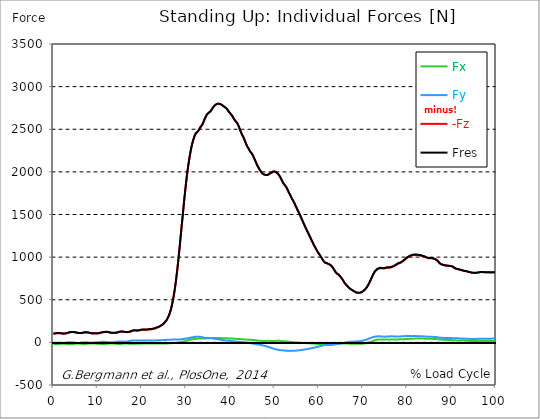
| Category |  Fx |  Fy |  -Fz |  Fres |
|---|---|---|---|---|
| 0.0 | -18.95 | -6.39 | 101.7 | 104.02 |
| 0.167348456675344 | -19.83 | -5.31 | 102.12 | 104.5 |
| 0.334696913350688 | -20.52 | -4.25 | 102.99 | 105.43 |
| 0.5020453700260321 | -20.93 | -3.79 | 104.69 | 107.17 |
| 0.669393826701376 | -21.33 | -3.33 | 106.39 | 108.9 |
| 0.83674228337672 | -21.33 | -2.93 | 106.82 | 109.28 |
| 1.0040907400520642 | -20.87 | -2.69 | 107.28 | 109.61 |
| 1.1621420602454444 | -20.38 | -2.68 | 107.64 | 109.83 |
| 1.3294905169207885 | -19.74 | -3.26 | 107.68 | 109.74 |
| 1.4968389735961325 | -18.73 | -4.31 | 106.97 | 108.9 |
| 1.6641874302714765 | -17.94 | -5.04 | 106.17 | 108.02 |
| 1.8315358869468206 | -17.32 | -5.8 | 104.8 | 106.67 |
| 1.9988843436221646 | -16.83 | -6.43 | 103.33 | 105.25 |
| 2.1662328002975086 | -16.65 | -6.46 | 102.22 | 104.13 |
| 2.333581256972853 | -16.76 | -5.99 | 101.69 | 103.56 |
| 2.5009297136481967 | -17.11 | -5.12 | 102.4 | 104.26 |
| 2.6682781703235405 | -17.43 | -4.11 | 103.78 | 105.62 |
| 2.8356266269988843 | -18.03 | -2.83 | 105.19 | 107.12 |
| 3.002975083674229 | -18.79 | -1.62 | 106.74 | 108.77 |
| 3.1703235403495724 | -19.62 | -0.56 | 108.51 | 110.61 |
| 3.337671997024917 | -20.6 | 0.59 | 111.41 | 113.63 |
| 3.4957233172182973 | -21.47 | 1.48 | 114.79 | 117.12 |
| 3.663071773893641 | -21.78 | 1.9 | 117.22 | 119.61 |
| 3.8304202305689854 | -21.71 | 1.78 | 119.08 | 121.42 |
| 3.997768687244329 | -21.22 | 1.15 | 120 | 122.26 |
| 4.165117143919673 | -20.63 | 0.44 | 120.67 | 122.82 |
| 4.332465600595017 | -19.9 | -0.43 | 120.97 | 123.01 |
| 4.499814057270361 | -18.93 | -1.57 | 120.66 | 122.59 |
| 4.667162513945706 | -17.88 | -2.87 | 119.97 | 121.8 |
| 4.834510970621049 | -16.75 | -4.29 | 118.52 | 120.27 |
| 5.001859427296393 | -15.74 | -5.57 | 116.65 | 118.37 |
| 5.169207883971737 | -15.13 | -6.3 | 114.49 | 116.21 |
| 5.336556340647081 | -14.53 | -6.85 | 112.23 | 113.95 |
| 5.503904797322425 | -14.3 | -6.91 | 110.85 | 112.57 |
| 5.671253253997769 | -14.35 | -6.66 | 109.73 | 111.44 |
| 5.82930457419115 | -14.7 | -6 | 108.88 | 110.58 |
| 5.996653030866494 | -15.18 | -5.16 | 108.25 | 109.96 |
| 6.164001487541838 | -15.8 | -4.09 | 108.26 | 110.01 |
| 6.331349944217181 | -16.39 | -3.07 | 108.8 | 110.62 |
| 6.498698400892526 | -17.21 | -1.79 | 109.92 | 111.84 |
| 6.66604685756787 | -17.98 | -0.72 | 111.76 | 113.8 |
| 6.833395314243213 | -18.41 | 0.12 | 113.68 | 115.89 |
| 7.000743770918558 | -18.77 | 0.9 | 115.55 | 117.91 |
| 7.168092227593902 | -18.75 | 1.13 | 116.49 | 118.83 |
| 7.335440684269246 | -18.21 | 0.77 | 116.96 | 119.2 |
| 7.50278914094459 | -17.17 | -0.14 | 117.09 | 119.18 |
| 7.6701375976199335 | -16.28 | -1.16 | 116.44 | 118.43 |
| 7.837486054295278 | -15.41 | -2.4 | 115.11 | 117.03 |
| 7.995537374488658 | -14.62 | -3.34 | 113.43 | 115.25 |
| 8.162885831164003 | -13.7 | -4.33 | 110.94 | 112.75 |
| 8.330234287839346 | -13.04 | -4.9 | 108.88 | 110.69 |
| 8.49758274451469 | -12.88 | -4.81 | 107.53 | 109.36 |
| 8.664931201190035 | -13.03 | -4.26 | 105.98 | 107.82 |
| 8.832279657865378 | -13.24 | -3.61 | 105.2 | 107.1 |
| 8.999628114540721 | -13.65 | -2.64 | 104.92 | 106.88 |
| 9.166976571216066 | -14.26 | -1.61 | 105.4 | 107.37 |
| 9.334325027891412 | -14.66 | -0.99 | 106.18 | 108.16 |
| 9.501673484566755 | -14.4 | -1.33 | 105.18 | 107.12 |
| 9.669021941242098 | -14.53 | -1.42 | 103.83 | 105.83 |
| 9.836370397917442 | -15.15 | -0.41 | 103.83 | 105.94 |
| 10.003718854592787 | -15.74 | 0.71 | 104.64 | 106.82 |
| 10.17106731126813 | -16.47 | 1.88 | 105.92 | 108.18 |
| 10.329118631461512 | -17.34 | 3.14 | 107.48 | 109.85 |
| 10.496467088136853 | -18.37 | 4.31 | 109.42 | 111.91 |
| 10.663815544812199 | -19.44 | 5.34 | 111.59 | 114.24 |
| 10.831164001487544 | -19.91 | 5.85 | 113.74 | 116.44 |
| 10.998512458162887 | -20.33 | 6.36 | 115.75 | 118.49 |
| 11.16586091483823 | -20.53 | 6.7 | 117.61 | 120.36 |
| 11.333209371513574 | -20.34 | 6.65 | 119.14 | 121.84 |
| 11.50055782818892 | -19.96 | 6.43 | 120.31 | 122.92 |
| 11.667906284864264 | -19.17 | 5.8 | 120.85 | 123.31 |
| 11.835254741539607 | -18.4 | 5.24 | 121.25 | 123.57 |
| 12.00260319821495 | -17.57 | 4.5 | 121.5 | 123.68 |
| 12.169951654890292 | -16.66 | 3.56 | 121.32 | 123.36 |
| 12.337300111565641 | -15.63 | 2.32 | 120.65 | 122.57 |
| 12.504648568240984 | -14.65 | 1.01 | 119.3 | 121.15 |
| 12.662699888434362 | -14.02 | 0.22 | 117.01 | 118.87 |
| 12.830048345109708 | -13.62 | -0.06 | 114.35 | 116.19 |
| 12.997396801785053 | -13.36 | -0.18 | 112.12 | 113.94 |
| 13.164745258460396 | -13.33 | 0.07 | 110.96 | 112.75 |
| 13.33209371513574 | -13.43 | 0.55 | 110.45 | 112.2 |
| 13.499442171811083 | -13.82 | 1.34 | 110.39 | 112.15 |
| 13.666790628486426 | -14.36 | 2.23 | 110.62 | 112.42 |
| 13.834139085161771 | -14.88 | 3.37 | 111.03 | 112.91 |
| 14.001487541837117 | -15.49 | 4.52 | 111.25 | 113.24 |
| 14.16883599851246 | -16.25 | 5.83 | 112.22 | 114.34 |
| 14.336184455187803 | -17.14 | 7.27 | 113.79 | 116.07 |
| 14.503532911863147 | -18.07 | 8.73 | 115.67 | 118.14 |
| 14.670881368538492 | -18.93 | 9.89 | 118.17 | 120.82 |
| 14.828932688731873 | -19.43 | 10.65 | 120.68 | 123.39 |
| 14.996281145407215 | -19.45 | 11 | 122.83 | 125.49 |
| 15.163629602082558 | -19.11 | 11.27 | 124.26 | 126.83 |
| 15.330978058757903 | -18.43 | 11.17 | 125.12 | 127.53 |
| 15.498326515433247 | -17.55 | 10.73 | 125.49 | 127.71 |
| 15.665674972108594 | -16.46 | 9.97 | 125.31 | 127.34 |
| 15.833023428783937 | -15.27 | 9.03 | 124.56 | 126.36 |
| 16.00037188545928 | -14.5 | 8.61 | 123.25 | 124.95 |
| 16.167720342134626 | -14.01 | 8.43 | 121.8 | 123.44 |
| 16.335068798809967 | -13.74 | 8.47 | 120.46 | 122.08 |
| 16.502417255485312 | -13.81 | 9.07 | 119.84 | 121.52 |
| 16.669765712160658 | -14.16 | 10.24 | 119.96 | 121.79 |
| 16.837114168836 | -14.66 | 11.73 | 120.41 | 122.44 |
| 17.004462625511344 | -15.26 | 13.4 | 121.23 | 123.51 |
| 17.16251394570472 | -15.92 | 15.22 | 122.33 | 124.89 |
| 17.32986240238007 | -16.68 | 16.99 | 123.91 | 126.77 |
| 17.497210859055414 | -17.42 | 18.82 | 126.84 | 130.02 |
| 17.664559315730756 | -17.77 | 20.68 | 131.81 | 135.21 |
| 17.8319077724061 | -17.7 | 21.65 | 134.82 | 138.28 |
| 17.999256229081443 | -17.43 | 22.18 | 137.16 | 140.61 |
| 18.166604685756788 | -17.04 | 22.25 | 138.45 | 141.85 |
| 18.333953142432133 | -16.48 | 21.97 | 139.06 | 142.39 |
| 18.501301599107478 | -15.66 | 21.23 | 139.08 | 142.28 |
| 18.668650055782823 | -15.13 | 20.84 | 138.05 | 141.19 |
| 18.835998512458165 | -14.66 | 20.53 | 136.92 | 140.01 |
| 19.00334696913351 | -14.44 | 20.67 | 136.9 | 139.95 |
| 19.170695425808855 | -14.57 | 21.19 | 137.94 | 140.99 |
| 19.338043882484197 | -14.85 | 21.8 | 139.03 | 142.14 |
| 19.496095202677576 | -14.75 | 22.27 | 141.09 | 144.27 |
| 19.66344365935292 | -14.87 | 23.18 | 143.44 | 146.82 |
| 19.830792116028263 | -14.69 | 23.71 | 145.34 | 148.83 |
| 19.998140572703612 | -14 | 23.32 | 146.78 | 150.2 |
| 20.165489029378953 | -13.68 | 23.1 | 146.99 | 150.36 |
| 20.3328374860543 | -13.72 | 23.26 | 146.9 | 150.29 |
| 20.500185942729644 | -13.92 | 23.66 | 147.67 | 151.07 |
| 20.667534399404985 | -13.24 | 23.11 | 147.7 | 151.02 |
| 20.83488285608033 | -12.76 | 22.62 | 147.37 | 150.63 |
| 21.002231312755672 | -12.52 | 22.38 | 147.09 | 150.32 |
| 21.16957976943102 | -12.3 | 22.67 | 147.82 | 151.14 |
| 21.336928226106362 | -12.22 | 23.26 | 149.07 | 152.52 |
| 21.504276682781704 | -12.39 | 23.76 | 150.97 | 154.52 |
| 21.67162513945705 | -12.21 | 23.61 | 152.28 | 155.76 |
| 21.82967645965043 | -12 | 23.01 | 152.2 | 155.53 |
| 21.997024916325774 | -11.8 | 22.41 | 152.11 | 155.29 |
| 22.16437337300112 | -11.9 | 22.53 | 152.92 | 156.05 |
| 22.33172182967646 | -12.11 | 22.96 | 155.62 | 158.8 |
| 22.499070286351806 | -11.99 | 23.09 | 157.98 | 161.13 |
| 22.666418743027148 | -11.96 | 23.01 | 159.74 | 162.86 |
| 22.833767199702496 | -11.93 | 22.93 | 161.5 | 164.58 |
| 23.00111565637784 | -12.1 | 22.74 | 163.49 | 166.49 |
| 23.168464113053183 | -12.46 | 23.01 | 166.6 | 169.6 |
| 23.335812569728528 | -13.22 | 23.83 | 171.28 | 174.37 |
| 23.50316102640387 | -13.68 | 24.16 | 175.34 | 178.43 |
| 23.670509483079215 | -13.35 | 23.53 | 177.13 | 180.07 |
| 23.83785793975456 | -13.6 | 23.95 | 180.99 | 183.93 |
| 23.995909259947936 | -13.93 | 24.53 | 185.18 | 188.16 |
| 24.163257716623285 | -14.23 | 25.14 | 189.67 | 192.67 |
| 24.330606173298627 | -14.26 | 25.81 | 195.99 | 199.02 |
| 24.49795462997397 | -14.14 | 26.16 | 201.3 | 204.3 |
| 24.665303086649313 | -14.01 | 26.51 | 206.6 | 209.58 |
| 24.83265154332466 | -13.96 | 27.32 | 214.2 | 217.13 |
| 25.0 | -13.74 | 27.9 | 222.13 | 224.99 |
| 25.167348456675345 | -13.43 | 28.34 | 230.17 | 232.95 |
| 25.334696913350694 | -13.08 | 28.65 | 241.11 | 243.79 |
| 25.502045370026035 | -12.74 | 28.96 | 253.12 | 255.7 |
| 25.669393826701377 | -12.45 | 29.4 | 266.22 | 268.7 |
| 25.836742283376722 | -12.02 | 29.55 | 281.76 | 284.12 |
| 26.004090740052067 | -11.54 | 29.63 | 299.74 | 301.97 |
| 26.17143919672741 | -11.18 | 29.87 | 321.17 | 323.26 |
| 26.329490516920792 | -10.83 | 30.53 | 344.52 | 346.5 |
| 26.49683897359613 | -10.69 | 31.3 | 372.14 | 374.03 |
| 26.66418743027148 | -10.32 | 32.02 | 405.16 | 406.94 |
| 26.831535886946828 | -9.51 | 32.58 | 443.07 | 444.72 |
| 26.998884343622166 | -8.47 | 32.81 | 486.25 | 487.76 |
| 27.166232800297514 | -7.79 | 33 | 532.6 | 533.99 |
| 27.333581256972852 | -7.38 | 33.29 | 582.32 | 583.61 |
| 27.5009297136482 | -6.59 | 33.5 | 638.77 | 639.96 |
| 27.668278170323543 | -5.3 | 33.6 | 700.53 | 701.61 |
| 27.835626626998888 | -4.01 | 33.65 | 769.99 | 770.96 |
| 28.002975083674233 | -2.94 | 33.77 | 845.2 | 846.08 |
| 28.170323540349575 | -2.08 | 34.15 | 921.95 | 922.75 |
| 28.33767199702492 | -1 | 34.62 | 1003.97 | 1004.71 |
| 28.50502045370026 | 0.47 | 35.14 | 1089.27 | 1089.96 |
| 28.663071773893645 | 2.12 | 35.21 | 1179.12 | 1179.76 |
| 28.830420230568986 | 4 | 35.57 | 1268 | 1268.6 |
| 28.99776868724433 | 5.78 | 36.4 | 1357.55 | 1358.15 |
| 29.165117143919673 | 7.48 | 37.52 | 1446.1 | 1446.71 |
| 29.33246560059502 | 9.39 | 39.18 | 1533.57 | 1534.2 |
| 29.499814057270367 | 11.73 | 40.61 | 1624.47 | 1625.13 |
| 29.66716251394571 | 14.02 | 41.93 | 1710.84 | 1711.53 |
| 29.834510970621054 | 16.18 | 43.02 | 1789.78 | 1790.49 |
| 30.00185942729639 | 18.64 | 44.64 | 1868.12 | 1868.88 |
| 30.169207883971744 | 21.11 | 46.15 | 1944.67 | 1945.48 |
| 30.33655634064708 | 23.44 | 47.69 | 2012.21 | 2013.08 |
| 30.50390479732243 | 25.78 | 49.54 | 2073.19 | 2074.13 |
| 30.671253253997772 | 27.84 | 51.16 | 2130.6 | 2131.59 |
| 30.829304574191156 | 29.73 | 52.86 | 2184.21 | 2185.26 |
| 30.996653030866494 | 31.62 | 54.97 | 2233.22 | 2234.33 |
| 31.164001487541842 | 33.61 | 57.15 | 2276.81 | 2277.99 |
| 31.331349944217187 | 35.44 | 58.9 | 2315.51 | 2316.75 |
| 31.498698400892525 | 36.93 | 60.42 | 2350.05 | 2351.33 |
| 31.666046857567874 | 38.24 | 61.96 | 2379.64 | 2380.96 |
| 31.833395314243212 | 39.53 | 63.42 | 2406.24 | 2407.61 |
| 32.00074377091856 | 40.9 | 64.6 | 2430.07 | 2431.48 |
| 32.1680922275939 | 42.04 | 66.1 | 2448.75 | 2450.22 |
| 32.33544068426925 | 42.78 | 66.81 | 2457.16 | 2458.65 |
| 32.50278914094459 | 43.4 | 67.12 | 2464.99 | 2466.5 |
| 32.670137597619934 | 43.88 | 67 | 2472.52 | 2474.03 |
| 32.83748605429528 | 44.17 | 66.46 | 2485.24 | 2486.72 |
| 33.004834510970625 | 44.36 | 65.78 | 2500.3 | 2501.75 |
| 33.162885831164004 | 44.44 | 64.95 | 2518.02 | 2519.44 |
| 33.33023428783935 | 44.59 | 64.14 | 2530.42 | 2531.81 |
| 33.497582744514695 | 44.51 | 62.87 | 2540.84 | 2542.18 |
| 33.664931201190036 | 44.38 | 61.35 | 2552.45 | 2553.74 |
| 33.83227965786538 | 44.6 | 59.26 | 2571.8 | 2573.03 |
| 33.99962811454073 | 44.6 | 56.2 | 2592.96 | 2594.12 |
| 34.16697657121607 | 44.98 | 52.89 | 2614.1 | 2615.21 |
| 34.33432502789141 | 45.64 | 51.89 | 2633.05 | 2634.15 |
| 34.50167348456676 | 46.86 | 51.38 | 2650.87 | 2651.99 |
| 34.6690219412421 | 47.68 | 50.07 | 2667.28 | 2668.39 |
| 34.83637039791744 | 48.88 | 50.07 | 2679.26 | 2680.39 |
| 35.00371885459279 | 49.5 | 50.25 | 2686.07 | 2687.22 |
| 35.17106731126814 | 50.19 | 49.84 | 2694.07 | 2695.23 |
| 35.338415767943474 | 50.49 | 49.52 | 2701.64 | 2702.8 |
| 35.49646708813686 | 50.67 | 49.27 | 2708.96 | 2710.13 |
| 35.6638155448122 | 50.89 | 48.69 | 2719.05 | 2720.2 |
| 35.831164001487544 | 51.17 | 47.76 | 2732.56 | 2733.7 |
| 35.998512458162885 | 51.65 | 46.46 | 2746.72 | 2747.84 |
| 36.165860914838234 | 52.19 | 45.1 | 2759.29 | 2760.4 |
| 36.333209371513576 | 52.53 | 43.53 | 2770.72 | 2771.81 |
| 36.50055782818892 | 52.52 | 41.55 | 2780.06 | 2781.12 |
| 36.667906284864266 | 51.93 | 39.77 | 2787.34 | 2788.37 |
| 36.83525474153961 | 51.25 | 38.24 | 2792.24 | 2793.23 |
| 37.002603198214956 | 50.57 | 37.38 | 2796.96 | 2797.92 |
| 37.1699516548903 | 50.26 | 36.47 | 2798.66 | 2799.61 |
| 37.337300111565646 | 50.01 | 35.22 | 2798.79 | 2799.72 |
| 37.50464856824098 | 50.08 | 34.15 | 2798.06 | 2798.99 |
| 37.66269988843437 | 50.1 | 32.91 | 2795.92 | 2796.84 |
| 37.83004834510971 | 50.04 | 31.35 | 2792.56 | 2793.48 |
| 37.99739680178505 | 49.88 | 29.79 | 2788.14 | 2789.06 |
| 38.16474525846039 | 49.46 | 28.24 | 2782.06 | 2782.96 |
| 38.33209371513574 | 48.65 | 26.58 | 2774.82 | 2775.69 |
| 38.49944217181109 | 48.17 | 25.16 | 2768.79 | 2769.65 |
| 38.666790628486424 | 48.08 | 23.99 | 2763.05 | 2763.9 |
| 38.83413908516178 | 47.91 | 22.76 | 2757.19 | 2758.04 |
| 39.001487541837115 | 47.64 | 21.49 | 2751.21 | 2752.05 |
| 39.16883599851246 | 47.36 | 20.64 | 2742.06 | 2742.89 |
| 39.336184455187805 | 47.03 | 20.19 | 2732.04 | 2732.88 |
| 39.503532911863154 | 46.82 | 19.83 | 2720.09 | 2720.92 |
| 39.670881368538495 | 46.29 | 20.03 | 2705.13 | 2705.96 |
| 39.83822982521384 | 46.03 | 18.93 | 2695.16 | 2695.99 |
| 39.996281145407224 | 45.87 | 17.73 | 2685.5 | 2686.33 |
| 40.163629602082565 | 45.66 | 16.47 | 2675.66 | 2676.49 |
| 40.33097805875791 | 45.22 | 15.48 | 2664.23 | 2665.06 |
| 40.498326515433256 | 44.74 | 14.49 | 2652.03 | 2652.87 |
| 40.6656749721086 | 43.96 | 13.43 | 2634.72 | 2635.56 |
| 40.83302342878393 | 43.15 | 12.28 | 2619.72 | 2620.56 |
| 41.00037188545929 | 42.45 | 11.26 | 2607.71 | 2608.55 |
| 41.16772034213463 | 41.82 | 10.43 | 2597.73 | 2598.57 |
| 41.33506879880997 | 41.38 | 9.6 | 2587.44 | 2588.3 |
| 41.50241725548531 | 41.06 | 8.76 | 2576.97 | 2577.84 |
| 41.66976571216066 | 40.67 | 8.12 | 2562.93 | 2563.8 |
| 41.837114168836 | 40.21 | 7.61 | 2543.01 | 2543.89 |
| 42.004462625511344 | 39.63 | 6.84 | 2521.35 | 2522.22 |
| 42.17181108218669 | 38.76 | 6.01 | 2498.41 | 2499.29 |
| 42.32986240238007 | 37.81 | 5.02 | 2476.21 | 2477.08 |
| 42.497210859055414 | 36.92 | 4.38 | 2454.61 | 2455.47 |
| 42.66455931573076 | 36.57 | 3.66 | 2436.86 | 2437.73 |
| 42.831907772406105 | 36.21 | 3 | 2420.46 | 2421.34 |
| 42.999256229081446 | 35.81 | 2.28 | 2403.3 | 2404.18 |
| 43.16660468575679 | 34.69 | 1.13 | 2382.13 | 2383.02 |
| 43.33395314243214 | 33.83 | 0.17 | 2360.02 | 2360.9 |
| 43.50130159910748 | 33.21 | -0.47 | 2338.43 | 2339.32 |
| 43.66865005578282 | 32.49 | -1.14 | 2317.87 | 2318.75 |
| 43.83599851245817 | 31.44 | -2 | 2298.36 | 2299.25 |
| 44.00334696913351 | 30.79 | -3.3 | 2282.78 | 2283.68 |
| 44.17069542580886 | 30.47 | -4.91 | 2270.1 | 2271.02 |
| 44.3380438824842 | 29.85 | -6.44 | 2252.74 | 2253.69 |
| 44.49609520267758 | 29.58 | -8.17 | 2237.77 | 2238.74 |
| 44.66344365935292 | 29.63 | -9.83 | 2227.21 | 2228.23 |
| 44.83079211602827 | 29.38 | -11.67 | 2216.89 | 2217.97 |
| 44.99814057270361 | 29.12 | -13.15 | 2203.04 | 2204.16 |
| 45.16548902937895 | 28.73 | -14.45 | 2186.82 | 2187.96 |
| 45.332837486054295 | 27.56 | -15.9 | 2166.68 | 2167.83 |
| 45.500185942729644 | 26.47 | -17.05 | 2147.42 | 2148.59 |
| 45.66753439940499 | 25.32 | -18.38 | 2128.2 | 2129.39 |
| 45.83488285608033 | 23.77 | -19.82 | 2108.15 | 2109.37 |
| 46.00223131275568 | 22.32 | -21.3 | 2087.95 | 2089.19 |
| 46.16957976943102 | 21.27 | -22.86 | 2070.03 | 2071.32 |
| 46.336928226106366 | 20.43 | -24.2 | 2054.08 | 2055.4 |
| 46.50427668278171 | 19.83 | -25.61 | 2038.1 | 2039.45 |
| 46.671625139457056 | 19.29 | -27.27 | 2023.62 | 2025 |
| 46.829676459650436 | 18.77 | -28.86 | 2010.26 | 2011.66 |
| 46.99702491632577 | 18.22 | -30.49 | 1997.85 | 1999.26 |
| 47.16437337300112 | 17.55 | -32.87 | 1987.12 | 1988.53 |
| 47.33172182967646 | 16.98 | -35.37 | 1977.55 | 1978.97 |
| 47.49907028635181 | 16.89 | -37.79 | 1971.44 | 1972.85 |
| 47.66641874302716 | 17.12 | -40.09 | 1968.29 | 1969.69 |
| 47.83376719970249 | 17.3 | -42.41 | 1966.06 | 1967.49 |
| 48.001115656377834 | 17.39 | -44.08 | 1962.87 | 1964.32 |
| 48.16846411305319 | 17.44 | -45.89 | 1960.5 | 1961.99 |
| 48.33581256972853 | 17.58 | -48.23 | 1962.06 | 1963.56 |
| 48.50316102640387 | 17.75 | -50.53 | 1965.33 | 1966.82 |
| 48.67050948307921 | 17.88 | -53.5 | 1969.05 | 1970.53 |
| 48.837857939754564 | 17.16 | -56.79 | 1975.62 | 1977.16 |
| 49.005206396429905 | 16.42 | -60.11 | 1982.37 | 1984 |
| 49.163257716623285 | 16.41 | -62.84 | 1984.5 | 1986.18 |
| 49.33060617329863 | 16.77 | -65.36 | 1989.47 | 1991.22 |
| 49.49795462997397 | 17.1 | -68.01 | 1995.98 | 1997.82 |
| 49.66530308664932 | 17.11 | -70.8 | 2001.95 | 2003.87 |
| 49.832651543324666 | 16.87 | -74 | 2004.3 | 2006.31 |
| 50.0 | 16.83 | -77.18 | 2003.79 | 2005.9 |
| 50.16734845667534 | 17.33 | -79.4 | 2001.47 | 2003.67 |
| 50.33469691335069 | 17.47 | -81.22 | 1995.03 | 1997.29 |
| 50.50204537002604 | 18.16 | -83.22 | 1989.42 | 1991.75 |
| 50.66939382670139 | 18.85 | -85.38 | 1982.25 | 1984.63 |
| 50.836742283376715 | 18.55 | -87.07 | 1973.04 | 1975.5 |
| 51.00409074005207 | 18.14 | -89.01 | 1962.13 | 1964.68 |
| 51.17143919672741 | 17.72 | -90.49 | 1948.32 | 1950.93 |
| 51.32949051692079 | 17.23 | -91.41 | 1933.58 | 1936.22 |
| 51.496838973596134 | 16.56 | -91.84 | 1917.01 | 1919.66 |
| 51.66418743027148 | 15.51 | -92.17 | 1898.76 | 1901.43 |
| 51.831535886946824 | 14.08 | -92.86 | 1881.08 | 1883.82 |
| 51.99888434362217 | 13.44 | -94.27 | 1866.05 | 1868.86 |
| 52.16623280029752 | 13.19 | -95.65 | 1853.83 | 1856.72 |
| 52.33358125697285 | 12.95 | -96.46 | 1842.42 | 1845.36 |
| 52.5009297136482 | 12.63 | -96.9 | 1831.1 | 1834.07 |
| 52.668278170323546 | 12.05 | -97.56 | 1818.37 | 1821.37 |
| 52.835626626998895 | 10.95 | -98.32 | 1802.55 | 1805.57 |
| 53.00297508367424 | 9.61 | -99 | 1783.55 | 1786.61 |
| 53.17032354034958 | 8.43 | -99.66 | 1764.79 | 1767.9 |
| 53.33767199702492 | 7.39 | -100.01 | 1747.81 | 1750.95 |
| 53.50502045370027 | 6.7 | -99.66 | 1731.56 | 1734.69 |
| 53.663071773893655 | 5.82 | -99.64 | 1713.57 | 1716.72 |
| 53.83042023056899 | 5 | -99.71 | 1695.72 | 1698.89 |
| 53.99776868724433 | 4.08 | -99.37 | 1679.71 | 1682.88 |
| 54.16511714391967 | 3.4 | -98.9 | 1664.7 | 1667.86 |
| 54.33246560059503 | 2.61 | -98.88 | 1649.37 | 1652.53 |
| 54.49981405727037 | 1.71 | -98.29 | 1630.66 | 1633.8 |
| 54.667162513945705 | 0.84 | -98 | 1612.35 | 1615.51 |
| 54.834510970621054 | -0.19 | -97.32 | 1593.59 | 1596.75 |
| 55.0018594272964 | -1.12 | -96.29 | 1574.87 | 1577.99 |
| 55.169207883971744 | -1.76 | -95.26 | 1556.77 | 1559.85 |
| 55.336556340647086 | -2.34 | -94.55 | 1540.38 | 1543.45 |
| 55.50390479732243 | -3.01 | -93.54 | 1522.53 | 1525.56 |
| 55.671253253997776 | -3.76 | -92.37 | 1503.36 | 1506.35 |
| 55.83860171067312 | -4.4 | -91.3 | 1483.61 | 1486.57 |
| 55.9966530308665 | -4.86 | -90.17 | 1463.87 | 1466.8 |
| 56.16400148754184 | -5.42 | -88.8 | 1444.08 | 1446.96 |
| 56.33134994421718 | -5.89 | -87.26 | 1425.05 | 1427.87 |
| 56.498698400892536 | -6.4 | -86.04 | 1405.33 | 1408.11 |
| 56.66604685756788 | -7.11 | -84.77 | 1385.47 | 1388.22 |
| 56.83339531424321 | -7.87 | -83.21 | 1366.09 | 1368.79 |
| 57.00074377091856 | -8.38 | -81.76 | 1347.29 | 1349.94 |
| 57.16809222759391 | -8.64 | -80.06 | 1328.86 | 1331.45 |
| 57.33544068426925 | -9.3 | -78.27 | 1310.7 | 1313.22 |
| 57.5027891409446 | -9.77 | -77.1 | 1294.15 | 1296.64 |
| 57.670137597619934 | -10.25 | -75.48 | 1275.9 | 1278.34 |
| 57.83748605429528 | -10.67 | -74.43 | 1257.1 | 1259.52 |
| 58.004834510970625 | -11.18 | -72.66 | 1238.82 | 1241.19 |
| 58.16288583116401 | -11.9 | -70.51 | 1220.8 | 1223.09 |
| 58.330234287839346 | -12.43 | -68.42 | 1203.07 | 1205.29 |
| 58.497582744514695 | -13 | -66.41 | 1184.75 | 1186.9 |
| 58.66493120119004 | -13.4 | -64.48 | 1166.53 | 1168.62 |
| 58.832279657865385 | -13.58 | -62.84 | 1148.66 | 1150.71 |
| 58.999628114540734 | -14.04 | -61.37 | 1131.5 | 1133.52 |
| 59.16697657121607 | -14.78 | -59.48 | 1115.45 | 1117.43 |
| 59.33432502789142 | -15.72 | -57.39 | 1100.33 | 1102.26 |
| 59.50167348456676 | -16.93 | -55.56 | 1085.46 | 1087.35 |
| 59.66902194124211 | -17.68 | -53.31 | 1070.42 | 1072.26 |
| 59.83637039791745 | -18.46 | -50.73 | 1055.45 | 1057.23 |
| 60.00371885459278 | -19.34 | -48.32 | 1042.35 | 1044.06 |
| 60.17106731126813 | -20.29 | -46.09 | 1031.04 | 1032.68 |
| 60.33841576794349 | -20.41 | -44.23 | 1017.06 | 1018.63 |
| 60.49646708813685 | -20.47 | -42 | 1002.97 | 1004.51 |
| 60.6638155448122 | -20.47 | -39.64 | 988.92 | 990.45 |
| 60.831164001487544 | -20.37 | -37.12 | 974.1 | 975.61 |
| 60.99851245816289 | -20.31 | -34.66 | 960.45 | 961.96 |
| 61.16586091483824 | -20.15 | -32.76 | 948.52 | 950.04 |
| 61.333209371513576 | -20.22 | -31.25 | 938.68 | 940.22 |
| 61.50055782818892 | -20.57 | -29.84 | 932.53 | 934.06 |
| 61.667906284864266 | -20.49 | -29.79 | 930.81 | 932.35 |
| 61.835254741539615 | -19.99 | -30.27 | 928.64 | 930.2 |
| 62.002603198214956 | -19.32 | -30.93 | 923.67 | 925.28 |
| 62.16995165489029 | -19.16 | -31.04 | 919.23 | 920.85 |
| 62.33730011156564 | -19.3 | -30.82 | 915.67 | 917.29 |
| 62.504648568240995 | -19.43 | -30.61 | 912.02 | 913.65 |
| 62.67199702491633 | -19.16 | -30.57 | 906.53 | 908.18 |
| 62.83004834510971 | -18.74 | -29.75 | 898.42 | 900.1 |
| 62.99739680178505 | -18.29 | -29.15 | 888.94 | 890.64 |
| 63.1647452584604 | -17.79 | -28.47 | 877.31 | 879.01 |
| 63.33209371513575 | -17.32 | -27.83 | 864.38 | 866.08 |
| 63.4994421718111 | -16.68 | -26.66 | 850.38 | 852.07 |
| 63.666790628486424 | -16 | -24.85 | 835.13 | 836.79 |
| 63.83413908516177 | -15.56 | -22.94 | 822.03 | 823.67 |
| 64.00148754183712 | -15.31 | -20.99 | 811.37 | 812.99 |
| 64.16883599851248 | -15.23 | -19.52 | 803.68 | 805.27 |
| 64.3361844551878 | -15.24 | -18.07 | 799.84 | 801.42 |
| 64.50353291186315 | -15.12 | -16.74 | 794.33 | 795.88 |
| 64.6708813685385 | -14.83 | -15.55 | 784.65 | 786.19 |
| 64.83822982521384 | -14.41 | -14.32 | 774.22 | 775.77 |
| 65.00557828188919 | -14 | -12.99 | 763.98 | 765.51 |
| 65.16362960208257 | -13.82 | -11.2 | 752.69 | 754.2 |
| 65.3309780587579 | -13.61 | -9.54 | 740.57 | 742.03 |
| 65.49832651543326 | -13.36 | -7.71 | 727.06 | 728.48 |
| 65.6656749721086 | -13.42 | -5.46 | 711.85 | 713.21 |
| 65.83302342878395 | -13.46 | -3.25 | 697.87 | 699.17 |
| 66.00037188545929 | -13.52 | -1.26 | 686.54 | 687.81 |
| 66.16772034213463 | -13.74 | 0.21 | 677.2 | 678.44 |
| 66.33506879880998 | -13.96 | 1.19 | 668.98 | 670.21 |
| 66.50241725548531 | -14.11 | 2.7 | 658.84 | 660.04 |
| 66.66976571216065 | -14.48 | 4.37 | 649.31 | 650.5 |
| 66.83711416883601 | -14.69 | 5.8 | 640.21 | 641.38 |
| 67.00446262551135 | -14.9 | 7.19 | 632.04 | 633.18 |
| 67.1718110821867 | -15.24 | 8.03 | 625.59 | 626.68 |
| 67.32986240238007 | -15.53 | 7.96 | 620.02 | 621.05 |
| 67.49721085905541 | -15.94 | 7.88 | 615.05 | 616.03 |
| 67.66455931573076 | -16.14 | 8.71 | 609.99 | 610.93 |
| 67.83190777240611 | -16.16 | 9.26 | 604.03 | 604.93 |
| 67.99925622908145 | -16.25 | 8.96 | 598.34 | 599.2 |
| 68.16660468575678 | -16.32 | 9.74 | 593.53 | 594.36 |
| 68.33395314243214 | -16.11 | 10.54 | 588.25 | 589.06 |
| 68.50130159910749 | -16.38 | 11.31 | 585.39 | 586.19 |
| 68.66865005578282 | -16.44 | 11.85 | 582.9 | 583.68 |
| 68.83599851245816 | -16.04 | 12.42 | 580.82 | 581.58 |
| 69.00334696913352 | -16.18 | 13.36 | 580.83 | 581.6 |
| 69.17069542580886 | -16.11 | 14.32 | 580.86 | 581.63 |
| 69.3380438824842 | -16.05 | 15.19 | 581.85 | 582.62 |
| 69.50539233915956 | -15.86 | 16.2 | 584.71 | 585.51 |
| 69.66344365935292 | -15.57 | 17.45 | 588.29 | 589.1 |
| 69.83079211602826 | -15.19 | 18.85 | 593.11 | 593.94 |
| 69.99814057270362 | -14.64 | 20.43 | 598.82 | 599.67 |
| 70.16548902937896 | -14.08 | 22.38 | 605.84 | 606.73 |
| 70.33283748605429 | -13.14 | 24.67 | 613.27 | 614.22 |
| 70.50018594272964 | -11.79 | 27.22 | 621.87 | 622.88 |
| 70.667534399405 | -10.39 | 30.23 | 631.97 | 633.08 |
| 70.83488285608033 | -8.76 | 33.45 | 643.32 | 644.56 |
| 71.00223131275568 | -6.75 | 36.76 | 655.94 | 657.33 |
| 71.16957976943102 | -4.36 | 40.25 | 670.45 | 672.01 |
| 71.33692822610637 | -1.78 | 43.91 | 686.47 | 688.25 |
| 71.50427668278171 | 0.98 | 47.51 | 703.65 | 705.67 |
| 71.67162513945706 | 4.19 | 50.96 | 721.83 | 724.08 |
| 71.8389735961324 | 7.81 | 54.5 | 740.54 | 743.08 |
| 71.99702491632577 | 11.05 | 57.57 | 759.35 | 762.15 |
| 72.16437337300113 | 14.56 | 60.9 | 779.79 | 782.87 |
| 72.33172182967647 | 17.93 | 63.3 | 797.1 | 800.4 |
| 72.49907028635181 | 21.14 | 65.18 | 812.94 | 816.42 |
| 72.66641874302715 | 24.17 | 66.64 | 826.63 | 830.26 |
| 72.8337671997025 | 26.95 | 67.86 | 838.27 | 842.03 |
| 73.00111565637783 | 29.16 | 68.81 | 847.12 | 851.01 |
| 73.16846411305319 | 30.93 | 69.68 | 854.17 | 858.16 |
| 73.33581256972853 | 32.3 | 70.41 | 859.07 | 863.16 |
| 73.50316102640387 | 33.44 | 70.67 | 863.27 | 867.43 |
| 73.67050948307921 | 34.52 | 70.8 | 867.28 | 871.49 |
| 73.83785793975457 | 34.33 | 70.31 | 870.11 | 874.33 |
| 74.00520639642991 | 34.3 | 69.73 | 870.98 | 875.23 |
| 74.16325771662328 | 34.58 | 69.06 | 869.31 | 873.58 |
| 74.33060617329863 | 34.78 | 68.42 | 867.8 | 872.12 |
| 74.49795462997398 | 34.82 | 67.84 | 866.7 | 871.07 |
| 74.66530308664932 | 34.71 | 67.38 | 866.56 | 870.97 |
| 74.83265154332466 | 34.46 | 67.04 | 867.32 | 871.75 |
| 75.00000000000001 | 34.35 | 67.04 | 869.29 | 873.75 |
| 75.16734845667534 | 34.42 | 67.56 | 872.8 | 877.3 |
| 75.3346969133507 | 34.26 | 68.02 | 875.27 | 879.8 |
| 75.50204537002605 | 33.83 | 68.47 | 875.43 | 879.93 |
| 75.66939382670138 | 33.36 | 68.91 | 875.28 | 879.74 |
| 75.83674228337672 | 33.08 | 69.4 | 875.59 | 880.02 |
| 76.00409074005208 | 32.85 | 69.9 | 876.05 | 880.45 |
| 76.17143919672742 | 32.68 | 70.34 | 877.71 | 882.08 |
| 76.33878765340276 | 32.53 | 70.76 | 879.7 | 884.03 |
| 76.49683897359614 | 32.45 | 70.78 | 882.76 | 887.05 |
| 76.66418743027148 | 32.4 | 70.6 | 886.36 | 890.61 |
| 76.83153588694682 | 32.61 | 70.33 | 890.1 | 894.34 |
| 76.99888434362218 | 33.01 | 70 | 893.96 | 898.21 |
| 77.16623280029752 | 32.97 | 70.19 | 897.97 | 902.27 |
| 77.33358125697285 | 32.95 | 69.42 | 903.35 | 907.63 |
| 77.5009297136482 | 33.03 | 68.5 | 908.83 | 913.08 |
| 77.66827817032356 | 33.53 | 68.56 | 914.76 | 919.03 |
| 77.83562662699889 | 33.97 | 69.12 | 921.19 | 925.48 |
| 78.00297508367423 | 34.3 | 69.92 | 925.18 | 929.52 |
| 78.17032354034959 | 35.29 | 69.65 | 927.17 | 931.54 |
| 78.33767199702493 | 35.75 | 69.76 | 929.22 | 933.63 |
| 78.50502045370027 | 35.83 | 70.24 | 933.07 | 937.53 |
| 78.67236891037561 | 36.04 | 70.66 | 938.23 | 942.74 |
| 78.83042023056899 | 36.67 | 71 | 943.94 | 948.51 |
| 78.99776868724433 | 37.29 | 71.12 | 950.38 | 955.01 |
| 79.16511714391969 | 37.37 | 71.59 | 956.06 | 960.73 |
| 79.33246560059503 | 37.5 | 71.95 | 962.88 | 967.62 |
| 79.49981405727036 | 37.63 | 72.83 | 970.46 | 975.3 |
| 79.66716251394571 | 38.57 | 74.47 | 979.22 | 984.23 |
| 79.83451097062107 | 39.01 | 74.94 | 986.96 | 992.03 |
| 80.00185942729641 | 39.39 | 75.02 | 992.22 | 997.31 |
| 80.16920788397174 | 39.93 | 74.93 | 997.75 | 1002.87 |
| 80.33655634064709 | 40.25 | 74.2 | 1002.26 | 1007.39 |
| 80.50390479732243 | 40.69 | 73.72 | 1007.91 | 1013.06 |
| 80.67125325399778 | 41.39 | 73.71 | 1013 | 1018.15 |
| 80.83860171067312 | 41.78 | 73.37 | 1015.53 | 1020.67 |
| 80.99665303086651 | 42.37 | 72.96 | 1018.4 | 1023.53 |
| 81.16400148754184 | 43 | 73.34 | 1021.63 | 1026.82 |
| 81.3313499442172 | 43.54 | 73.43 | 1022.5 | 1027.69 |
| 81.49869840089255 | 43.98 | 73.57 | 1024.23 | 1029.46 |
| 81.66604685756786 | 44.4 | 73.76 | 1025.53 | 1030.78 |
| 81.83339531424322 | 45.01 | 73.71 | 1026.04 | 1031.3 |
| 82.00074377091858 | 45.76 | 73.49 | 1025.59 | 1030.84 |
| 82.16809222759392 | 46.28 | 73.16 | 1024.73 | 1029.97 |
| 82.33544068426926 | 46.18 | 73.03 | 1023.88 | 1029.09 |
| 82.50278914094459 | 46.16 | 72.92 | 1022.61 | 1027.8 |
| 82.67013759761994 | 46.18 | 72.84 | 1021.05 | 1026.22 |
| 82.83748605429528 | 46.24 | 72.66 | 1019.81 | 1024.93 |
| 83.00483451097062 | 45.72 | 72.15 | 1018.42 | 1023.45 |
| 83.17218296764597 | 45.16 | 71.8 | 1016.77 | 1021.71 |
| 83.33023428783935 | 44.93 | 71.22 | 1013.88 | 1018.75 |
| 83.4975827445147 | 44.77 | 70.46 | 1010.51 | 1015.3 |
| 83.66493120119004 | 44.61 | 70.26 | 1008.26 | 1012.98 |
| 83.83227965786537 | 43.84 | 70.19 | 1006.05 | 1010.69 |
| 83.99962811454073 | 43.01 | 69.83 | 1003.19 | 1007.73 |
| 84.16697657121607 | 42.41 | 69.12 | 999.43 | 1003.86 |
| 84.33432502789142 | 42.2 | 68.31 | 995.01 | 999.37 |
| 84.50167348456677 | 42.03 | 67.23 | 990.83 | 995.1 |
| 84.6690219412421 | 41.84 | 66.61 | 988.43 | 992.64 |
| 84.83637039791745 | 41.66 | 66.1 | 986.62 | 990.78 |
| 85.0037188545928 | 41.51 | 65.92 | 986.69 | 990.79 |
| 85.17106731126813 | 41.36 | 65.74 | 986.75 | 990.8 |
| 85.33841576794349 | 41.21 | 65.55 | 986.78 | 990.78 |
| 85.50576422461883 | 41.27 | 65.29 | 985.91 | 989.85 |
| 85.66381554481221 | 41.32 | 65.02 | 985.04 | 988.93 |
| 85.83116400148755 | 40.82 | 64.5 | 982.99 | 986.8 |
| 85.99851245816289 | 40.31 | 63.98 | 980.95 | 984.67 |
| 86.16586091483823 | 40.2 | 63.74 | 977.96 | 981.64 |
| 86.33320937151358 | 40.1 | 63.51 | 974.96 | 978.59 |
| 86.50055782818893 | 39.36 | 62.71 | 970.33 | 973.85 |
| 86.66790628486427 | 38.46 | 61.78 | 964.02 | 967.44 |
| 86.83525474153961 | 37.48 | 60.49 | 956.92 | 960.2 |
| 87.00260319821496 | 36.2 | 58.49 | 947.13 | 950.22 |
| 87.16995165489031 | 34.77 | 56.43 | 936.86 | 939.75 |
| 87.33730011156564 | 33.92 | 55.19 | 927.86 | 930.63 |
| 87.504648568241 | 33.12 | 54.08 | 920.58 | 923.24 |
| 87.67199702491634 | 32.61 | 53.32 | 915.55 | 918.14 |
| 87.83004834510972 | 32.21 | 52.98 | 912.26 | 914.8 |
| 87.99739680178506 | 31.88 | 52.87 | 909.88 | 912.4 |
| 88.1647452584604 | 31.32 | 52.47 | 907.81 | 910.28 |
| 88.33209371513574 | 30.59 | 52.03 | 904.84 | 907.25 |
| 88.49944217181108 | 30.05 | 51.88 | 902.47 | 904.85 |
| 88.66679062848644 | 29.75 | 51.87 | 900.98 | 903.35 |
| 88.83413908516178 | 29.41 | 51.96 | 899.97 | 902.32 |
| 89.00148754183712 | 29.06 | 52.05 | 899.41 | 901.75 |
| 89.16883599851246 | 28.51 | 51.5 | 898.11 | 900.4 |
| 89.33618445518782 | 28.13 | 51.27 | 897.56 | 899.82 |
| 89.50353291186315 | 27.41 | 50.97 | 895.54 | 897.76 |
| 89.6708813685385 | 27.2 | 50.9 | 895.07 | 897.26 |
| 89.83822982521386 | 26.98 | 50.76 | 894.66 | 896.84 |
| 90.00557828188919 | 26.61 | 50.45 | 893.53 | 895.67 |
| 90.16362960208257 | 25.89 | 49.86 | 890.78 | 892.88 |
| 90.3309780587579 | 25.1 | 49.18 | 885.66 | 887.69 |
| 90.49832651543326 | 24.41 | 48.6 | 879.71 | 881.69 |
| 90.66567497210859 | 24.3 | 48.51 | 872.37 | 874.36 |
| 90.83302342878395 | 24.05 | 48.43 | 867.98 | 869.95 |
| 91.00037188545929 | 23.55 | 48.08 | 864.57 | 866.52 |
| 91.16772034213463 | 23.32 | 47.77 | 861.1 | 863.03 |
| 91.33506879880998 | 22.97 | 47.39 | 859.1 | 860.99 |
| 91.50241725548533 | 22.97 | 47.18 | 857.23 | 859.09 |
| 91.66976571216065 | 23.22 | 47.04 | 855.71 | 857.55 |
| 91.83711416883601 | 22.96 | 46.64 | 853.63 | 855.45 |
| 92.00446262551137 | 22.65 | 46.12 | 850.39 | 852.17 |
| 92.1718110821867 | 22.26 | 45.64 | 848.43 | 850.16 |
| 92.33915953886203 | 21.85 | 45.18 | 846.26 | 847.95 |
| 92.49721085905541 | 21.47 | 44.57 | 843.96 | 845.59 |
| 92.66455931573077 | 21.12 | 43.89 | 841.01 | 842.59 |
| 92.83190777240611 | 20.72 | 43.36 | 838.58 | 840.12 |
| 92.99925622908145 | 20.19 | 43 | 836.98 | 838.48 |
| 93.1666046857568 | 19.58 | 42.65 | 836.15 | 837.61 |
| 93.33395314243214 | 18.95 | 42.27 | 835.34 | 836.77 |
| 93.50130159910749 | 18.6 | 42.36 | 832.89 | 834.31 |
| 93.66865005578283 | 18.35 | 42.42 | 829.4 | 830.81 |
| 93.83599851245818 | 17.82 | 41.78 | 827.04 | 828.42 |
| 94.00334696913353 | 17.42 | 41.22 | 824.84 | 826.19 |
| 94.17069542580886 | 17.04 | 40.62 | 822.98 | 824.29 |
| 94.3380438824842 | 16.77 | 40.38 | 820.4 | 821.71 |
| 94.50539233915954 | 16.31 | 40.12 | 818.81 | 820.11 |
| 94.66344365935292 | 15.89 | 39.95 | 817.29 | 818.59 |
| 94.83079211602828 | 15.61 | 40.1 | 815.93 | 817.24 |
| 94.99814057270362 | 15.39 | 40.2 | 814.8 | 816.11 |
| 95.16548902937897 | 15.4 | 40.15 | 814.37 | 815.69 |
| 95.33283748605432 | 15.4 | 40.1 | 813.95 | 815.27 |
| 95.50018594272963 | 15.32 | 40.31 | 815.16 | 816.49 |
| 95.66753439940499 | 15.32 | 40.59 | 816.36 | 817.71 |
| 95.83488285608034 | 15.64 | 40.96 | 816.82 | 818.18 |
| 96.00223131275567 | 15.86 | 41.32 | 818.34 | 819.71 |
| 96.16957976943102 | 16.03 | 41.69 | 820.35 | 821.73 |
| 96.33692822610638 | 16.39 | 41.65 | 821.62 | 823 |
| 96.50427668278171 | 16.75 | 41.62 | 822.89 | 824.27 |
| 96.67162513945706 | 16.68 | 41.68 | 824.39 | 825.78 |
| 96.8389735961324 | 16.58 | 41.64 | 825.35 | 826.73 |
| 96.99702491632577 | 16.65 | 41.62 | 824.89 | 826.27 |
| 97.16437337300111 | 16.83 | 41.75 | 823.58 | 824.98 |
| 97.33172182967647 | 16.95 | 41.98 | 822.25 | 823.66 |
| 97.49907028635181 | 16.96 | 42.26 | 821.32 | 822.74 |
| 97.66641874302715 | 16.97 | 42.64 | 821.2 | 822.64 |
| 97.8337671997025 | 16.95 | 43.06 | 821.21 | 822.68 |
| 98.00111565637785 | 16.83 | 43.59 | 821.7 | 823.18 |
| 98.16846411305319 | 16.71 | 43.99 | 822.08 | 823.59 |
| 98.33581256972855 | 16.59 | 43.84 | 822.08 | 823.59 |
| 98.50316102640389 | 16.52 | 43.89 | 821.55 | 823.06 |
| 98.67050948307921 | 16.58 | 43.93 | 820.47 | 821.99 |
| 98.83785793975456 | 16.67 | 43.92 | 819.86 | 821.39 |
| 99.0052063964299 | 16.63 | 43.89 | 819.87 | 821.4 |
| 99.17255485310525 | 16.41 | 44.27 | 819.72 | 821.27 |
| 99.33060617329863 | 16.42 | 44.13 | 819.96 | 821.52 |
| 99.49795462997399 | 16.36 | 44.09 | 820.91 | 822.46 |
| 99.66530308664933 | 16.11 | 44.42 | 822.93 | 824.5 |
| 99.83265154332467 | 16.28 | 44.53 | 823.02 | 824.59 |
| 100.0 | 16.37 | 44.86 | 823.73 | 825.32 |